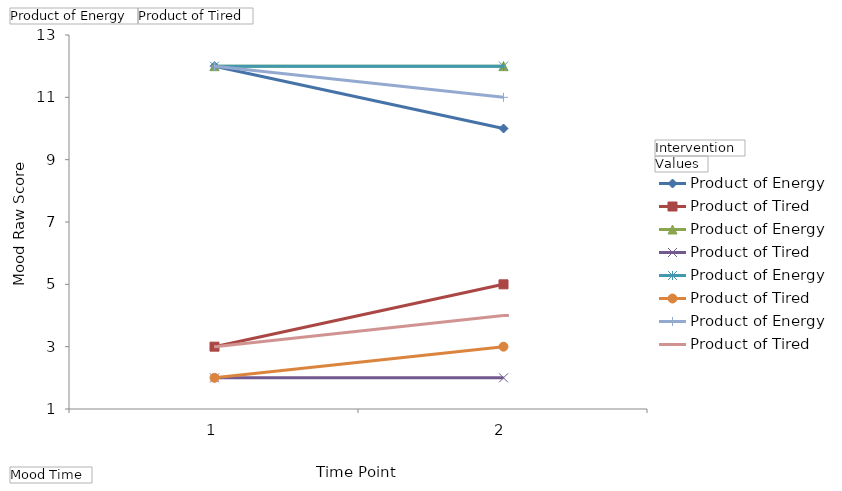
| Category | Audio Book - Product of Energy | Audio Book - Product of Tired | Motivational Music - Product of Energy | Motivational Music - Product of Tired | Neutral Music - Product of Energy | Neutral Music - Product of Tired | No Music - Product of Energy | No Music - Product of Tired |
|---|---|---|---|---|---|---|---|---|
| 1 | 12 | 3 | 12 | 2 | 12 | 2 | 12 | 3 |
| 2 | 10 | 5 | 12 | 2 | 12 | 3 | 11 | 4 |